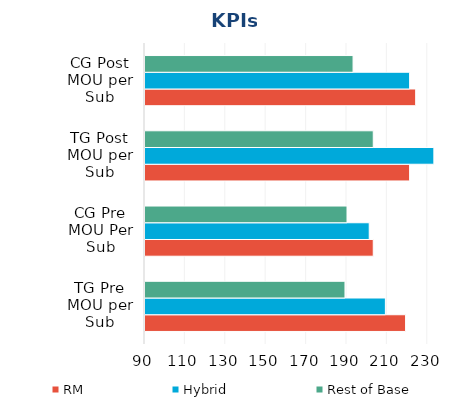
| Category | RM | Hybrid | Rest of Base |
|---|---|---|---|
| TG Pre MOU per Sub | 219 | 209 | 189 |
| CG Pre MOU Per Sub | 203 | 201 | 190 |
| TG Post MOU per Sub | 221 | 233 | 203 |
| CG Post MOU per Sub | 224 | 221 | 193 |